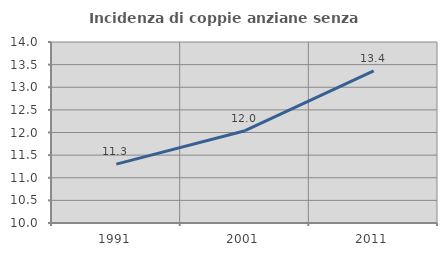
| Category | Incidenza di coppie anziane senza figli  |
|---|---|
| 1991.0 | 11.301 |
| 2001.0 | 12.039 |
| 2011.0 | 13.361 |